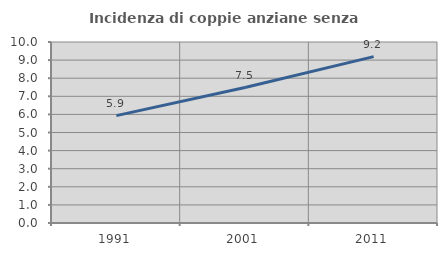
| Category | Incidenza di coppie anziane senza figli  |
|---|---|
| 1991.0 | 5.933 |
| 2001.0 | 7.485 |
| 2011.0 | 9.193 |